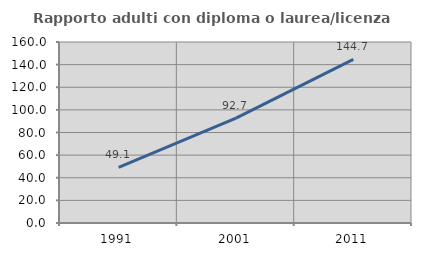
| Category | Rapporto adulti con diploma o laurea/licenza media  |
|---|---|
| 1991.0 | 49.111 |
| 2001.0 | 92.688 |
| 2011.0 | 144.696 |